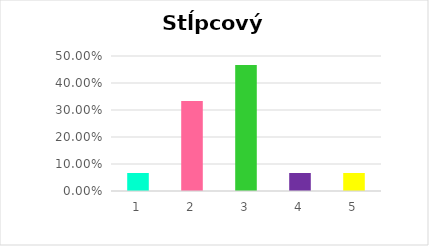
| Category | Series 0 |
|---|---|
| 0 | 0.067 |
| 1 | 0.333 |
| 2 | 0.467 |
| 3 | 0.067 |
| 4 | 0.067 |